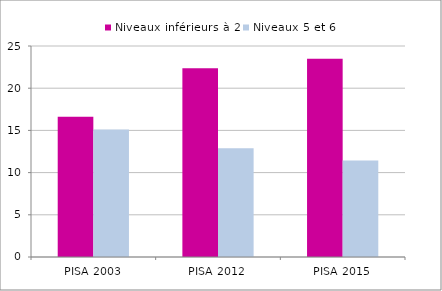
| Category | Niveaux inférieurs à 2 | Niveaux 5 et 6 |
|---|---|---|
| PISA 2003 | 16.631 | 15.114 |
| PISA 2012 | 22.354 | 12.891 |
| PISA 2015 | 23.478 | 11.444 |